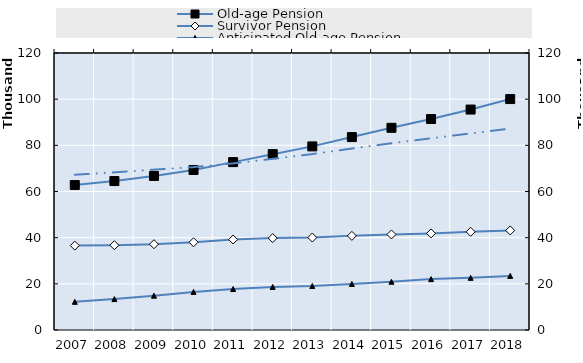
| Category | Old-age Pension | Survivor Pension |
|---|---|---|
| 2007.0 | 62799 | 36571 |
| 2008.0 | 64529 | 36739 |
| 2009.0 | 66742 | 37168 |
| 2010.0 | 69313 | 38007 |
| 2011.0 | 72731 | 39200 |
| 2012.0 | 76179 | 39814 |
| 2013.0 | 79540 | 40050 |
| 2014.0 | 83574 | 40782 |
| 2015.0 | 87596 | 41389 |
| 2016.0 | 91398 | 41855 |
| 2017.0 | 95498 | 42542 |
| 2018.0 | 100045 | 43141 |